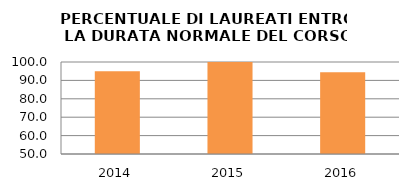
| Category | 2014 2015 2016 |
|---|---|
| 2014.0 | 95 |
| 2015.0 | 100 |
| 2016.0 | 94.444 |